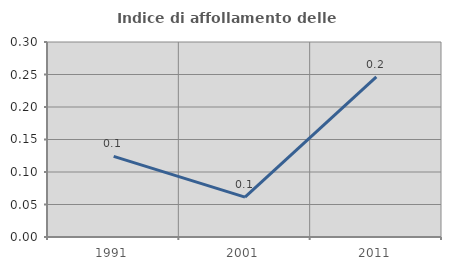
| Category | Indice di affollamento delle abitazioni  |
|---|---|
| 1991.0 | 0.124 |
| 2001.0 | 0.061 |
| 2011.0 | 0.246 |